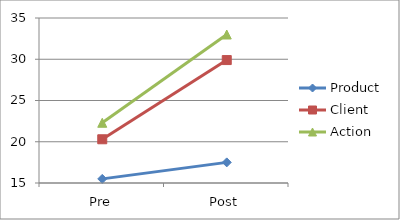
| Category | Product | Client | Action |
|---|---|---|---|
| Pre | 15.5 | 20.3 | 22.3 |
| Post | 17.5 | 29.9 | 33 |